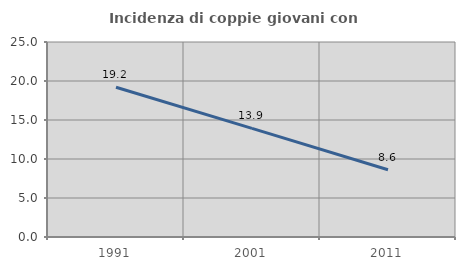
| Category | Incidenza di coppie giovani con figli |
|---|---|
| 1991.0 | 19.204 |
| 2001.0 | 13.923 |
| 2011.0 | 8.627 |